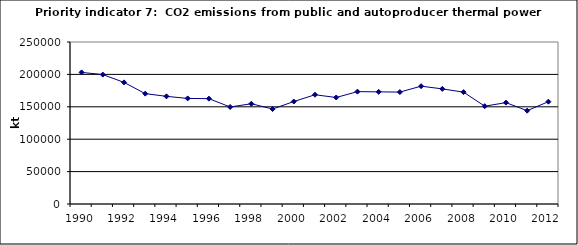
| Category | CO2 emissions from public and autoproducer thermal power stations, kt |
|---|---|
| 1990 | 203096.274 |
| 1991 | 199711.115 |
| 1992 | 187675.945 |
| 1993 | 170303.531 |
| 1994 | 166147.273 |
| 1995 | 162910.562 |
| 1996 | 162561.482 |
| 1997 | 149729.46 |
| 1998 | 154727.539 |
| 1999 | 146577.125 |
| 2000 | 158154.49 |
| 2001 | 168602.834 |
| 2002 | 164339.645 |
| 2003 | 173423.589 |
| 2004 | 173034.578 |
| 2005 | 172714.393 |
| 2006 | 181835.445 |
| 2007 | 177645.037 |
| 2008 | 172623.599 |
| 2009 | 150948.709 |
| 2010 | 156429.131 |
| 2011 | 144018.183 |
| 2012 | 157917.841 |